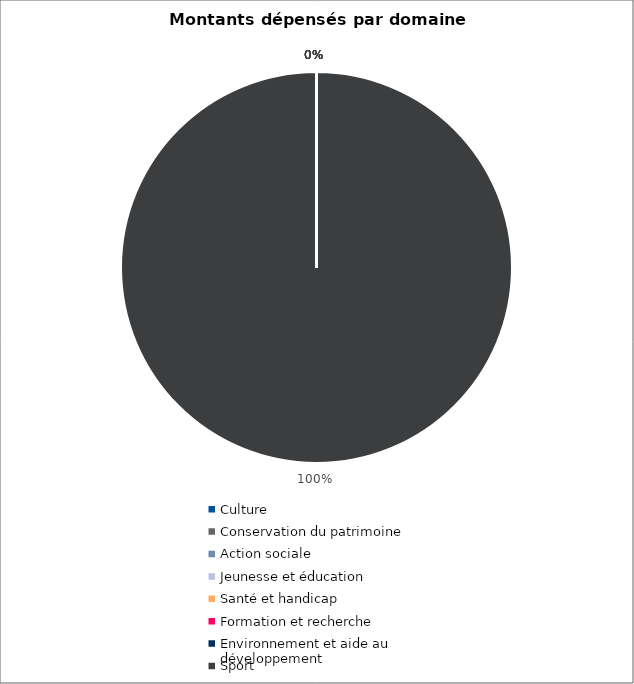
| Category | Series 0 |
|---|---|
| Culture | 0 |
| Conservation du patrimoine | 0 |
| Action sociale | 0 |
| Jeunesse et éducation | 0 |
| Santé et handicap | 0 |
| Formation et recherche | 0 |
| Environnement et aide au
développement | 0 |
| Sport | 1092848.55 |
| Autres projets d’utilité publique | 0 |